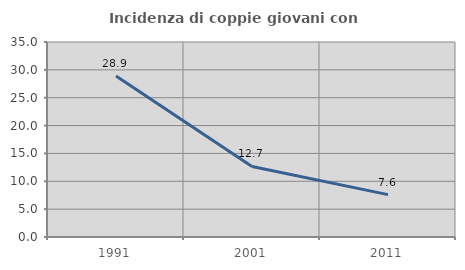
| Category | Incidenza di coppie giovani con figli |
|---|---|
| 1991.0 | 28.911 |
| 2001.0 | 12.658 |
| 2011.0 | 7.603 |